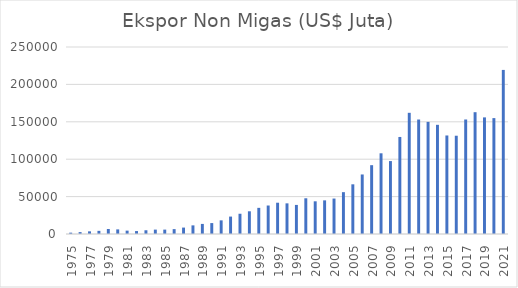
| Category | Ekspor Non Migas (US$ Juta) |
|---|---|
| 1975.0 | 1791.7 |
| 1976.0 | 2542.4 |
| 1977.0 | 3554.8 |
| 1978.0 | 4204.7 |
| 1979.0 | 6719.2 |
| 1980.0 | 6168.8 |
| 1981.0 | 4501.3 |
| 1982.0 | 3929 |
| 1983.0 | 5005.2 |
| 1984.0 | 5869.7 |
| 1985.0 | 5868.9 |
| 1986.0 | 6528.4 |
| 1987.0 | 8579.6 |
| 1988.0 | 11536.9 |
| 1989.0 | 13480.1 |
| 1990.0 | 14604.2 |
| 1991.0 | 18247.5 |
| 1992.0 | 23296.1 |
| 1993.0 | 27077.1 |
| 1994.0 | 30359.7 |
| 1995.0 | 34953.7 |
| 1996.0 | 38092.7 |
| 1997.0 | 41821 |
| 1998.0 | 40975.5 |
| 1999.0 | 38873.2 |
| 2000.0 | 47757.4 |
| 2001.0 | 43701.6 |
| 2002.0 | 44969.9 |
| 2003.0 | 47390.8 |
| 2004.0 | 55939.3 |
| 2005.0 | 66428.4 |
| 2006.0 | 79589.2 |
| 2007.0 | 92012.4 |
| 2008.0 | 107894.2 |
| 2009.0 | 97491.7 |
| 2010.0 | 129739.4 |
| 2011.0 | 162019.5 |
| 2012.0 | 153054.6 |
| 2013.0 | 149918.7 |
| 2014.0 | 145960.7 |
| 2015.0 | 131723.4 |
| 2016.0 | 131384.4 |
| 2017.0 | 153083.8 |
| 2018.0 | 162841 |
| 2019.0 | 155893.7 |
| 2020.0 | 154940.7 |
| 2021.0 | 219362.1 |